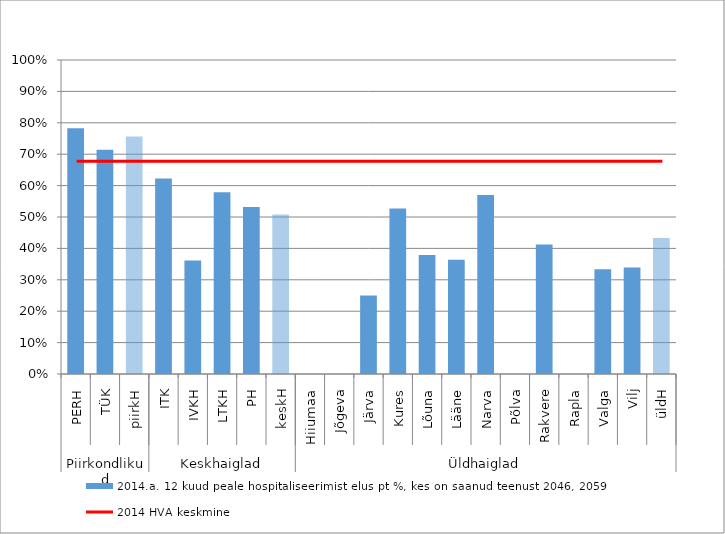
| Category | 2014.a. 12 kuud peale hospitaliseerimist elus pt %, kes on saanud teenust 2046, 2059 |
|---|---|
| 0 | 0.782 |
| 1 | 0.714 |
| 2 | 0.756 |
| 3 | 0.623 |
| 4 | 0.361 |
| 5 | 0.578 |
| 6 | 0.532 |
| 7 | 0.508 |
| 8 | 0 |
| 9 | 0 |
| 10 | 0.25 |
| 11 | 0.527 |
| 12 | 0.379 |
| 13 | 0.364 |
| 14 | 0.57 |
| 15 | 0 |
| 16 | 0.412 |
| 17 | 0 |
| 18 | 0.333 |
| 19 | 0.339 |
| 20 | 0.433 |